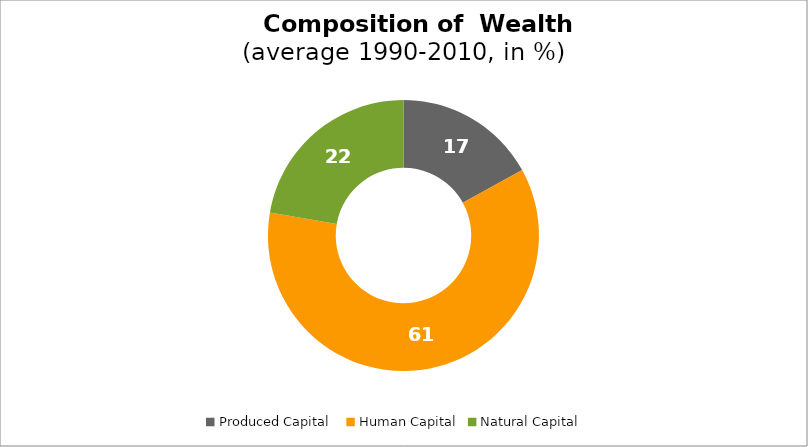
| Category | Series 0 |
|---|---|
| Produced Capital  | 16.979 |
| Human Capital | 60.726 |
| Natural Capital | 22.295 |